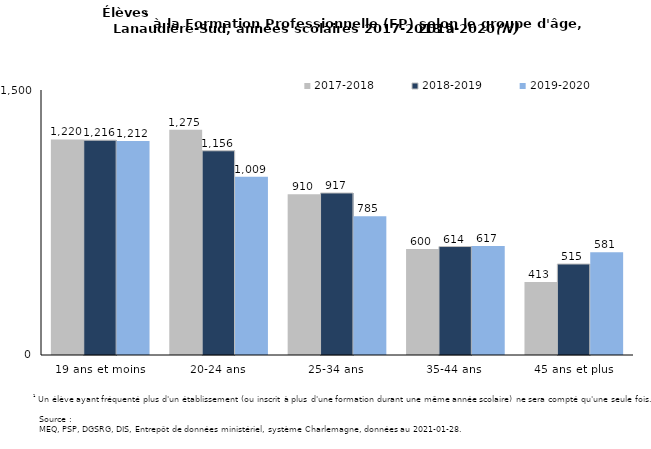
| Category | 2017-2018 | 2018-2019 | 2019-2020 |
|---|---|---|---|
| 19 ans et moins | 1220 | 1216 | 1212 |
| 20-24 ans | 1275 | 1156 | 1009 |
| 25-34 ans | 910 | 917 | 785 |
| 35-44 ans | 600 | 614 | 617 |
| 45 ans et plus | 413 | 515 | 581 |